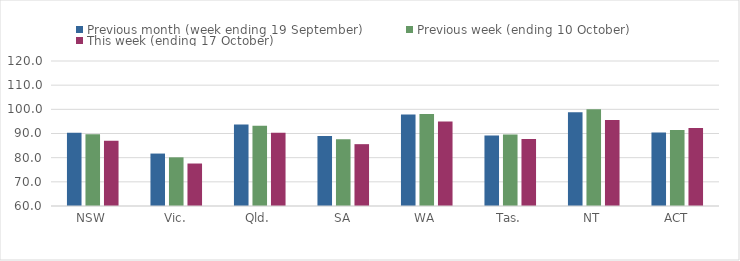
| Category | Previous month (week ending 19 September) | Previous week (ending 10 October) | This week (ending 17 October) |
|---|---|---|---|
| NSW | 90.32 | 89.73 | 86.97 |
| Vic. | 81.7 | 80.14 | 77.58 |
| Qld. | 93.75 | 93.16 | 90.28 |
| SA | 88.98 | 87.58 | 85.59 |
| WA | 97.9 | 98.02 | 95.01 |
| Tas. | 89.15 | 89.62 | 87.72 |
| NT | 98.75 | 100 | 95.63 |
| ACT | 90.44 | 91.42 | 92.32 |